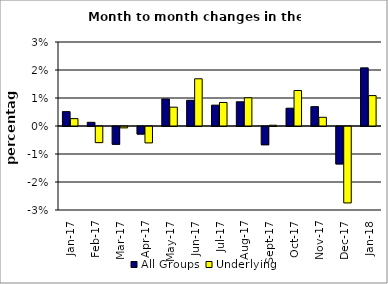
| Category | All Groups | Underlying |
|---|---|---|
| 2017-01-01 | 0.005 | 0.003 |
| 2017-02-01 | 0.001 | -0.006 |
| 2017-03-01 | -0.006 | 0 |
| 2017-04-01 | -0.003 | -0.006 |
| 2017-05-01 | 0.01 | 0.007 |
| 2017-06-01 | 0.009 | 0.017 |
| 2017-07-01 | 0.007 | 0.008 |
| 2017-08-01 | 0.009 | 0.01 |
| 2017-09-01 | -0.007 | 0 |
| 2017-10-01 | 0.006 | 0.013 |
| 2017-11-01 | 0.007 | 0.003 |
| 2017-12-01 | -0.013 | -0.027 |
| 2018-01-01 | 0.021 | 0.011 |